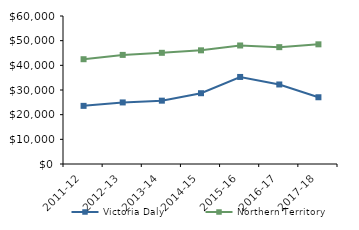
| Category | Victoria Daly | Northern Territory |
|---|---|---|
| 2011-12 | 23569 | 42481 |
| 2012-13 | 24961.17 | 44232.02 |
| 2013-14 | 25677.01 | 45075.51 |
| 2014-15 | 28697.35 | 46083.65 |
| 2015-16 | 35288 | 48046.27 |
| 2016-17 | 32243.88 | 47367.05 |
| 2017-18 | 27062 | 48519 |